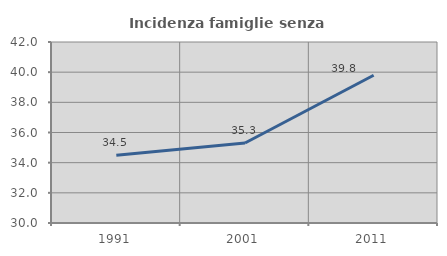
| Category | Incidenza famiglie senza nuclei |
|---|---|
| 1991.0 | 34.489 |
| 2001.0 | 35.304 |
| 2011.0 | 39.796 |